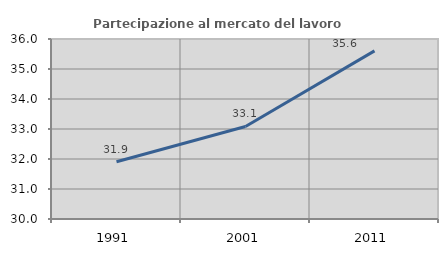
| Category | Partecipazione al mercato del lavoro  femminile |
|---|---|
| 1991.0 | 31.91 |
| 2001.0 | 33.084 |
| 2011.0 | 35.603 |